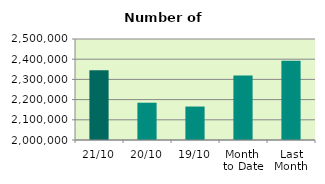
| Category | Series 0 |
|---|---|
| 21/10 | 2345308 |
| 20/10 | 2184576 |
| 19/10 | 2165672 |
| Month 
to Date | 2318851.2 |
| Last
Month | 2392468.182 |